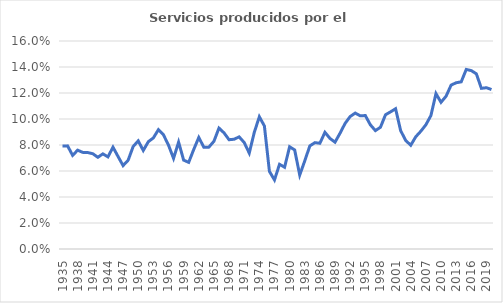
| Category | Servicios producidos por el gobierno |
|---|---|
| 1935.0 | 0.079 |
| 1936.0 | 0.079 |
| 1937.0 | 0.072 |
| 1938.0 | 0.076 |
| 1939.0 | 0.074 |
| 1940.0 | 0.074 |
| 1941.0 | 0.073 |
| 1942.0 | 0.071 |
| 1943.0 | 0.073 |
| 1944.0 | 0.071 |
| 1945.0 | 0.078 |
| 1946.0 | 0.071 |
| 1947.0 | 0.064 |
| 1948.0 | 0.068 |
| 1949.0 | 0.079 |
| 1950.0 | 0.083 |
| 1951.0 | 0.076 |
| 1952.0 | 0.083 |
| 1953.0 | 0.085 |
| 1954.0 | 0.092 |
| 1955.0 | 0.088 |
| 1956.0 | 0.08 |
| 1957.0 | 0.07 |
| 1958.0 | 0.082 |
| 1959.0 | 0.068 |
| 1960.0 | 0.067 |
| 1961.0 | 0.077 |
| 1962.0 | 0.086 |
| 1963.0 | 0.078 |
| 1964.0 | 0.078 |
| 1965.0 | 0.083 |
| 1966.0 | 0.093 |
| 1967.0 | 0.089 |
| 1968.0 | 0.084 |
| 1969.0 | 0.084 |
| 1970.0 | 0.086 |
| 1971.0 | 0.082 |
| 1972.0 | 0.074 |
| 1973.0 | 0.09 |
| 1974.0 | 0.102 |
| 1975.0 | 0.095 |
| 1976.0 | 0.06 |
| 1977.0 | 0.053 |
| 1978.0 | 0.065 |
| 1979.0 | 0.063 |
| 1980.0 | 0.079 |
| 1981.0 | 0.076 |
| 1982.0 | 0.057 |
| 1983.0 | 0.068 |
| 1984.0 | 0.079 |
| 1985.0 | 0.082 |
| 1986.0 | 0.081 |
| 1987.0 | 0.09 |
| 1988.0 | 0.085 |
| 1989.0 | 0.082 |
| 1990.0 | 0.089 |
| 1991.0 | 0.097 |
| 1992.0 | 0.102 |
| 1993.0 | 0.105 |
| 1994.0 | 0.102 |
| 1995.0 | 0.103 |
| 1996.0 | 0.096 |
| 1997.0 | 0.091 |
| 1998.0 | 0.094 |
| 1999.0 | 0.103 |
| 2000.0 | 0.106 |
| 2001.0 | 0.108 |
| 2002.0 | 0.091 |
| 2003.0 | 0.084 |
| 2004.0 | 0.08 |
| 2005.0 | 0.086 |
| 2006.0 | 0.091 |
| 2007.0 | 0.096 |
| 2008.0 | 0.103 |
| 2009.0 | 0.12 |
| 2010.0 | 0.113 |
| 2011.0 | 0.118 |
| 2012.0 | 0.126 |
| 2013.0 | 0.128 |
| 2014.0 | 0.129 |
| 2015.0 | 0.138 |
| 2016.0 | 0.137 |
| 2017.0 | 0.135 |
| 2018.0 | 0.124 |
| 2019.0 | 0.124 |
| 2020.0 | 0.123 |